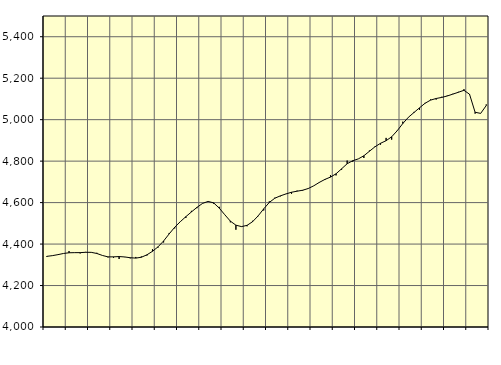
| Category | Piggar | Series 1 |
|---|---|---|
| nan | 4337.9 | 4340.74 |
| 1.0 | 4343.6 | 4344.11 |
| 1.0 | 4349.6 | 4349 |
| 1.0 | 4354.4 | 4354.65 |
| nan | 4366.4 | 4358 |
| 2.0 | 4358 | 4358.6 |
| 2.0 | 4354.8 | 4358.67 |
| 2.0 | 4362.2 | 4360.32 |
| nan | 4359.4 | 4360.01 |
| 3.0 | 4357.8 | 4354.58 |
| 3.0 | 4345.4 | 4345.06 |
| 3.0 | 4335.6 | 4338.28 |
| nan | 4333.7 | 4338.36 |
| 4.0 | 4327.9 | 4339.74 |
| 4.0 | 4337 | 4337.87 |
| 4.0 | 4331.2 | 4334.15 |
| nan | 4337.8 | 4332.28 |
| 5.0 | 4340.1 | 4336.36 |
| 5.0 | 4344.5 | 4348.13 |
| 5.0 | 4375 | 4365.01 |
| nan | 4383 | 4386.64 |
| 6.0 | 4407.7 | 4414.95 |
| 6.0 | 4453.6 | 4448.91 |
| 6.0 | 4475.5 | 4481.27 |
| nan | 4507.2 | 4507.86 |
| 7.0 | 4525.8 | 4532.16 |
| 7.0 | 4560.2 | 4554.89 |
| 7.0 | 4573.2 | 4577.01 |
| nan | 4595.2 | 4596.1 |
| 8.0 | 4606.1 | 4605.71 |
| 8.0 | 4594.6 | 4598.62 |
| 8.0 | 4579.6 | 4573.55 |
| nan | 4541.3 | 4541.46 |
| 9.0 | 4504.9 | 4510.66 |
| 9.0 | 4469.2 | 4491.08 |
| 9.0 | 4485.2 | 4484.22 |
| nan | 4485.8 | 4490.16 |
| 10.0 | 4512.2 | 4507.99 |
| 10.0 | 4534.5 | 4536.05 |
| 10.0 | 4562.1 | 4569.92 |
| nan | 4605.9 | 4600.67 |
| 11.0 | 4623.7 | 4621.21 |
| 11.0 | 4630.2 | 4632.61 |
| 11.0 | 4642.1 | 4641.84 |
| nan | 4642.5 | 4649.99 |
| 12.0 | 4657.7 | 4655 |
| 12.0 | 4657.3 | 4659.69 |
| 12.0 | 4669 | 4667.92 |
| nan | 4680.9 | 4681.07 |
| 13.0 | 4696 | 4697.54 |
| 13.0 | 4708.9 | 4711.82 |
| 13.0 | 4731.9 | 4722.99 |
| nan | 4731.1 | 4738.93 |
| 14.0 | 4758.5 | 4763.02 |
| 14.0 | 4802.8 | 4787.49 |
| 14.0 | 4796.9 | 4802.01 |
| nan | 4810.7 | 4810.78 |
| 15.0 | 4815.1 | 4825.84 |
| 15.0 | 4851.2 | 4847.54 |
| 15.0 | 4871.1 | 4869.19 |
| nan | 4879.5 | 4886.07 |
| 16.0 | 4912.1 | 4898.57 |
| 16.0 | 4903.7 | 4917.4 |
| 16.0 | 4945.4 | 4946.71 |
| nan | 4990.3 | 4981.28 |
| 17.0 | 5010.5 | 5011.35 |
| 17.0 | 5037.4 | 5034.26 |
| 17.0 | 5047.6 | 5056.88 |
| nan | 5080.9 | 5079.08 |
| 18.0 | 5097.7 | 5094.26 |
| 18.0 | 5096.9 | 5102.11 |
| 18.0 | 5110.4 | 5107.36 |
| nan | 5116.3 | 5114.28 |
| 19.0 | 5124.7 | 5123.21 |
| 19.0 | 5134.2 | 5132.18 |
| 19.0 | 5146.9 | 5141.6 |
| nan | 5119.7 | 5122.66 |
| 20.0 | 5029.1 | 5035.77 |
| 20.0 | 5029.8 | 5030.21 |
| 20.0 | 5073.4 | 5067.92 |